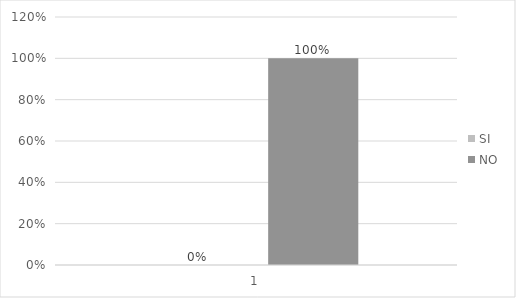
| Category | SI | NO |
|---|---|---|
| 0 | 0 | 1 |